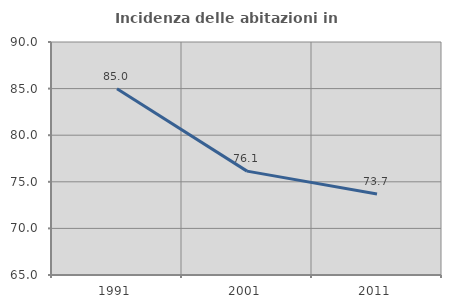
| Category | Incidenza delle abitazioni in proprietà  |
|---|---|
| 1991.0 | 84.979 |
| 2001.0 | 76.147 |
| 2011.0 | 73.702 |